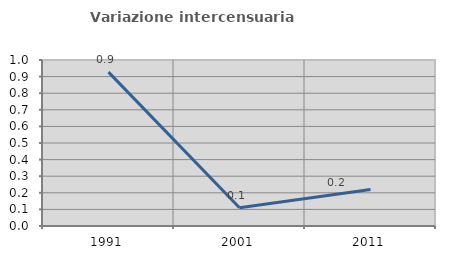
| Category | Variazione intercensuaria annua |
|---|---|
| 1991.0 | 0.927 |
| 2001.0 | 0.11 |
| 2011.0 | 0.22 |